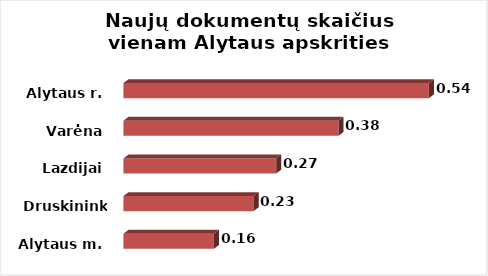
| Category | Series 0 |
|---|---|
| Alytaus m. | 0.16 |
| Druskininkai | 0.23 |
| Lazdijai | 0.27 |
| Varėna | 0.38 |
| Alytaus r. | 0.54 |